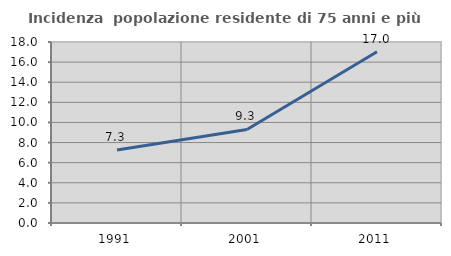
| Category | Incidenza  popolazione residente di 75 anni e più |
|---|---|
| 1991.0 | 7.257 |
| 2001.0 | 9.306 |
| 2011.0 | 17.029 |